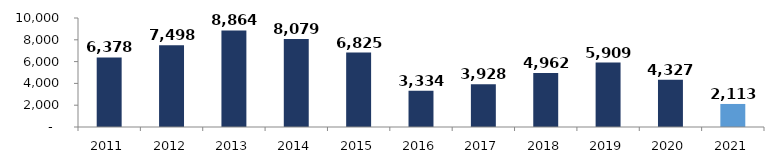
| Category | Series 0 |
|---|---|
| 2011.0 | 6377.615 |
| 2012.0 | 7498.207 |
| 2013.0 | 8863.622 |
| 2014.0 | 8079.21 |
| 2015.0 | 6824.624 |
| 2016.0 | 3333.564 |
| 2017.0 | 3928.017 |
| 2018.0 | 4961.838 |
| 2019.0 | 5908.679 |
| 2020.0 | 4327.23 |
| 2021.0 | 2112.976 |